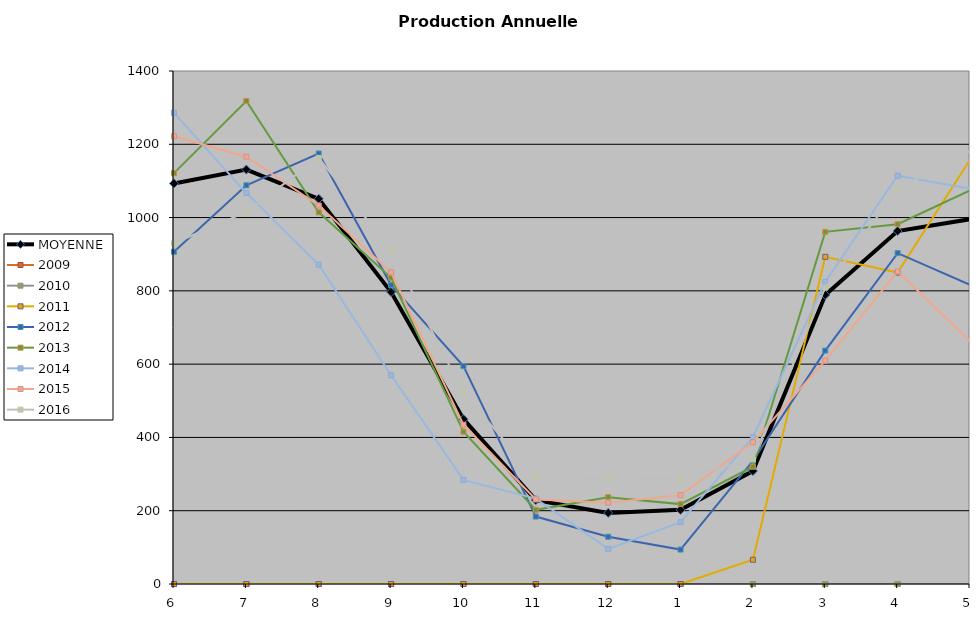
| Category | MOYENNE | 2009 | 2010 | 2011 | 2012 | 2013 | 2014 | 2015 | 2016 |
|---|---|---|---|---|---|---|---|---|---|
| 6 | 1093.2 | 0 | 0 | 0 | 906.875 | 1121.344 | 1285.833 | 1222 | 930 |
| 7 | 1131 | 0 | 0 | 0 | 1088.025 | 1318 | 1067.167 | 1166 | 1015.593 |
| 8 | 1051.2 | 0 | 0 | 0 | 1174.85 | 1014.286 | 871.263 | 1032.829 | 1162.836 |
| 9 | 796.8 | 0 | 0 | 0 | 815.75 | 835.714 | 569.737 | 850.771 | 910.571 |
| 10 | 449.8 | 0 | 0 | 0 | 594.5 | 415.594 | 284 | 434.659 | 520 |
| 11 | 228.8 | 0 | 0 | 0 | 184 | 202.406 | 233 | 230.644 | 293.636 |
| 12 | 194 | 0 | 0 | 0 | 129 | 237 | 95.818 | 221.839 | 286.364 |
| 1 | 202.4 | 0 | 0 | 0 | 94 | 218 | 168.582 | 242.516 | 288.118 |
| 2 | 308.333 | 0 | 0 | 66.2 | 336 | 320 | 400.6 | 386.742 | 339.882 |
| 3 | 789 | 0 | 0 | 892.8 | 637 | 961 | 824.7 | 609.344 | 808.818 |
| 4 | 963.333 | 0 | 0 | 850 | 903 | 982 | 1114.3 | 852.923 | 1078.182 |
| 5 | 995.5 | 0 | 0 | 1158 | 816.656 | 1074 | 1079 | 662.733 | 1182 |